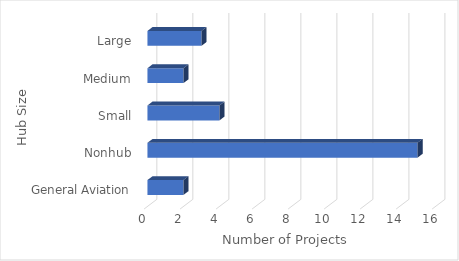
| Category | Series 0 |
|---|---|
| General Aviation | 2 |
| Nonhub | 15 |
| Small | 4 |
| Medium | 2 |
| Large | 3 |